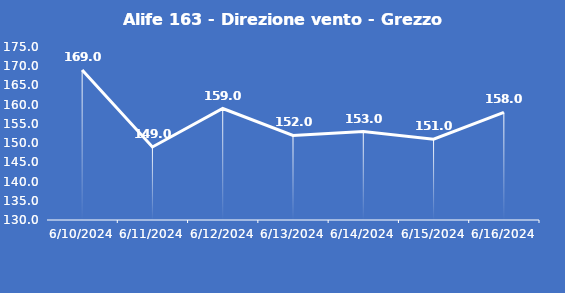
| Category | Alife 163 - Direzione vento - Grezzo (°N) |
|---|---|
| 6/10/24 | 169 |
| 6/11/24 | 149 |
| 6/12/24 | 159 |
| 6/13/24 | 152 |
| 6/14/24 | 153 |
| 6/15/24 | 151 |
| 6/16/24 | 158 |